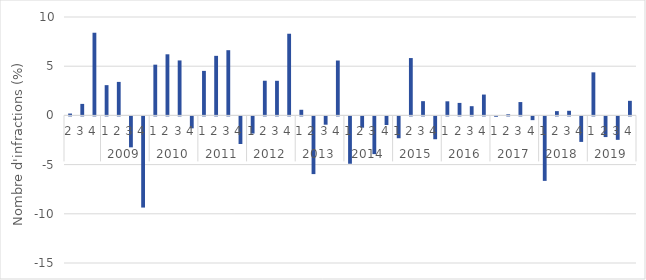
| Category | évolution trimestrielle (%) |
|---|---|
| 0 | 0.188 |
| 1 | 1.169 |
| 2 | 8.401 |
| 3 | 3.075 |
| 4 | 3.404 |
| 5 | -3.144 |
| 6 | -9.263 |
| 7 | 5.156 |
| 8 | 6.21 |
| 9 | 5.586 |
| 10 | -1.21 |
| 11 | 4.524 |
| 12 | 6.053 |
| 13 | 6.627 |
| 14 | -2.808 |
| 15 | -1.741 |
| 16 | 3.523 |
| 17 | 3.517 |
| 18 | 8.299 |
| 19 | 0.572 |
| 20 | -5.863 |
| 21 | -0.842 |
| 22 | 5.577 |
| 23 | -4.811 |
| 24 | -1.147 |
| 25 | -3.832 |
| 26 | -0.871 |
| 27 | -2.219 |
| 28 | 5.827 |
| 29 | 1.447 |
| 30 | -2.321 |
| 31 | 1.432 |
| 32 | 1.269 |
| 33 | 0.936 |
| 34 | 2.118 |
| 35 | -0.036 |
| 36 | 0.113 |
| 37 | 1.355 |
| 38 | -0.381 |
| 39 | -6.552 |
| 40 | 0.434 |
| 41 | 0.469 |
| 42 | -2.592 |
| 43 | 4.375 |
| 44 | -2.101 |
| 45 | -2.382 |
| 46 | 1.481 |